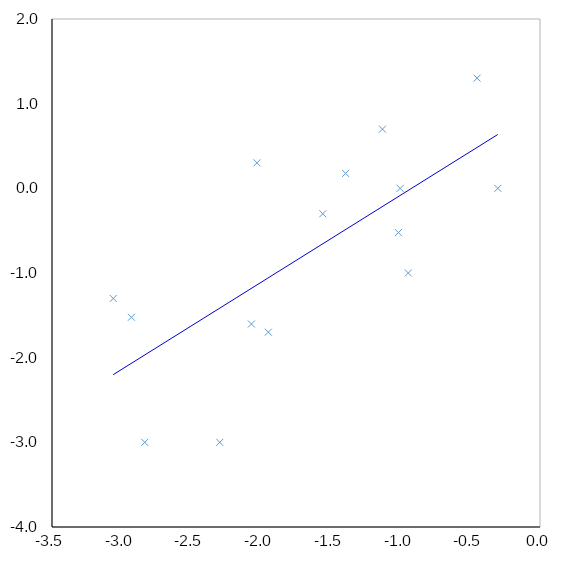
| Category | log10(efficacy) |
|---|---|
| -2.93059527034952 | -1.523 |
| -0.944866943822721 | -1 |
| -1.55805767764732 | -0.301 |
| -2.0299651347425 | 0.301 |
| -2.83481580608609 | -3 |
| -3.06071938730801 | -1.301 |
| -1.01552573209009 | -0.523 |
| -1.00283097144622 | 0 |
| -0.45140771035004 | 1.301 |
| -2.06976243384463 | -1.602 |
| -1.12996684958898 | 0.699 |
| -1.94857491376513 | -1.699 |
| -2.29682526073728 | -3 |
| -1.39423774666896 | 0.176 |
| -0.30261487101966 | 0 |